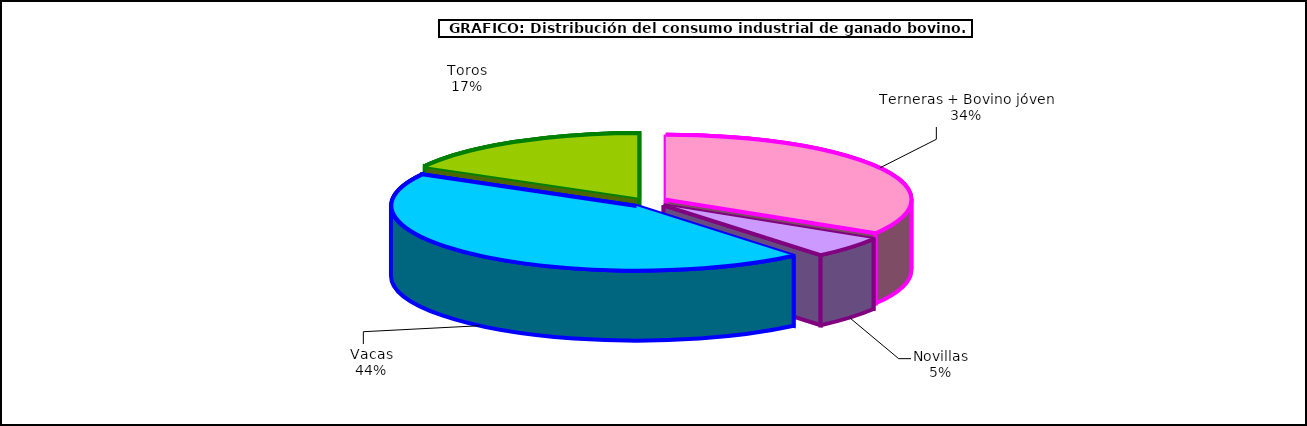
| Category | Series 0 |
|---|---|
| Terneras + Bovino jóven | 30035.342 |
| Novillas | 4704.382 |
| Vacas | 39352.821 |
| Toros | 15055.072 |